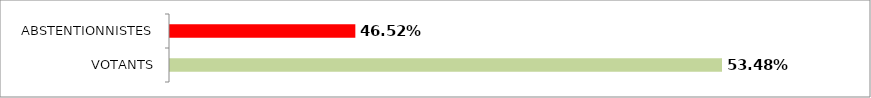
| Category | Series 0 |
|---|---|
| VOTANTS | 0.535 |
| ABSTENTIONNISTES | 0.465 |